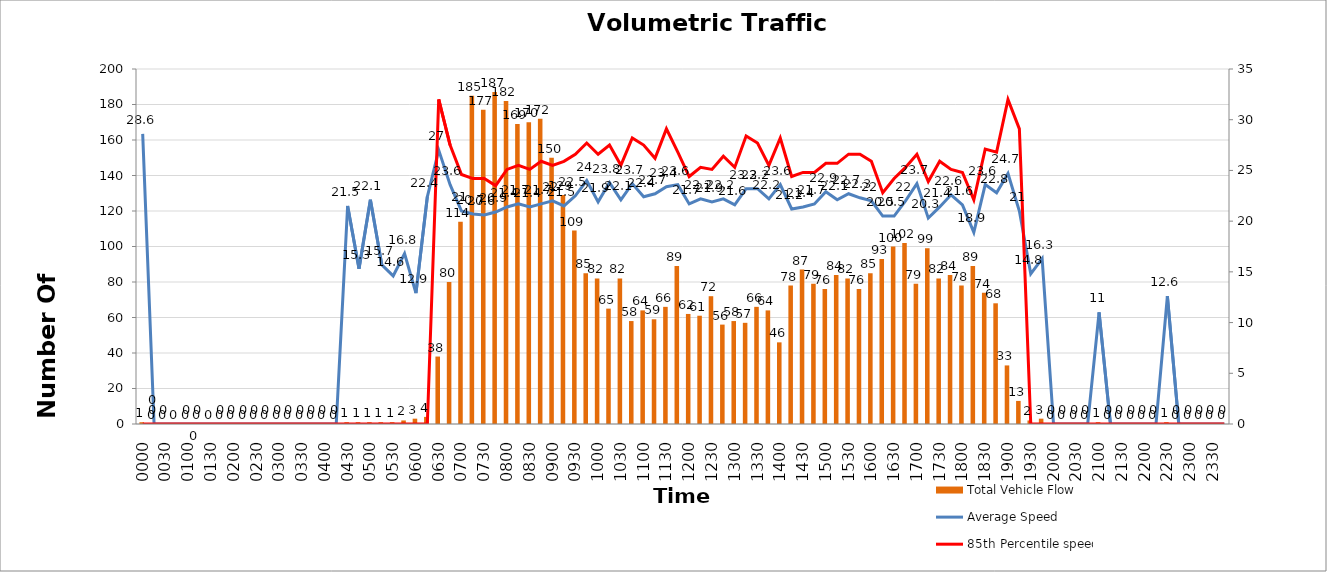
| Category | Total Vehicle Flow |
|---|---|
| 0000 | 1 |
| 0015 | 0 |
| 0030 | 0 |
| 0045 | 0 |
| 0100 | 0 |
| 0115 | 0 |
| 0130 | 0 |
| 0145 | 0 |
| 0200 | 0 |
| 0215 | 0 |
| 0230 | 0 |
| 0245 | 0 |
| 0300 | 0 |
| 0315 | 0 |
| 0330 | 0 |
| 0345 | 0 |
| 0400 | 0 |
| 0415 | 0 |
| 0430 | 1 |
| 0445 | 1 |
| 0500 | 1 |
| 0515 | 1 |
| 0530 | 1 |
| 0545 | 2 |
| 0600 | 3 |
| 0615 | 4 |
| 0630 | 38 |
| 0645 | 80 |
| 0700 | 114 |
| 0715 | 185 |
| 0730 | 177 |
| 0745 | 187 |
| 0800 | 182 |
| 0815 | 169 |
| 0830 | 170 |
| 0845 | 172 |
| 0900 | 150 |
| 0915 | 129 |
| 0930 | 109 |
| 0945 | 85 |
| 1000 | 82 |
| 1015 | 65 |
| 1030 | 82 |
| 1045 | 58 |
| 1100 | 64 |
| 1115 | 59 |
| 1130 | 66 |
| 1145 | 89 |
| 1200 | 62 |
| 1215 | 61 |
| 1230 | 72 |
| 1245 | 56 |
| 1300 | 58 |
| 1315 | 57 |
| 1330 | 66 |
| 1345 | 64 |
| 1400 | 46 |
| 1415 | 78 |
| 1430 | 87 |
| 1445 | 79 |
| 1500 | 76 |
| 1515 | 84 |
| 1530 | 82 |
| 1545 | 76 |
| 1600 | 85 |
| 1615 | 93 |
| 1630 | 100 |
| 1645 | 102 |
| 1700 | 79 |
| 1715 | 99 |
| 1730 | 82 |
| 1745 | 84 |
| 1800 | 78 |
| 1815 | 89 |
| 1830 | 74 |
| 1845 | 68 |
| 1900 | 33 |
| 1915 | 13 |
| 1930 | 2 |
| 1945 | 3 |
| 2000 | 0 |
| 2015 | 0 |
| 2030 | 0 |
| 2045 | 0 |
| 2100 | 1 |
| 2115 | 0 |
| 2130 | 0 |
| 2145 | 0 |
| 2200 | 0 |
| 2215 | 0 |
| 2230 | 1 |
| 2245 | 0 |
| 2300 | 0 |
| 2315 | 0 |
| 2330 | 0 |
| 2345 | 0 |